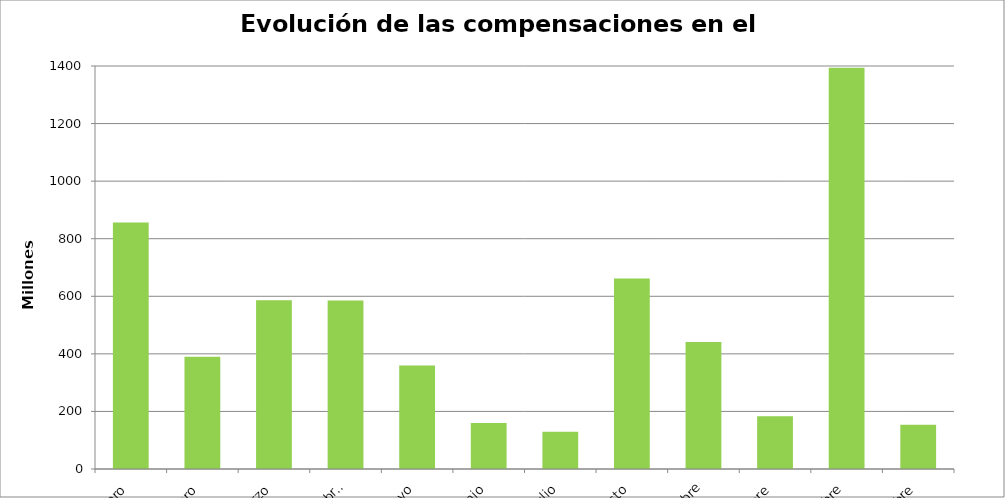
| Category | Enero |
|---|---|
| Enero | 855.979 |
| Febrero | 390.015 |
| Marzo | 586.528 |
| Abril | 585.723 |
| Mayo | 359.664 |
| Junio | 159.91 |
| Julio | 129.035 |
| Agosto | 661.645 |
| Septiembre | 441.136 |
| Octubre | 182.824 |
| Noviembre | 1394.106 |
| Diciembre | 153.554 |